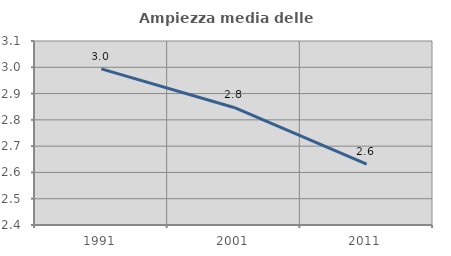
| Category | Ampiezza media delle famiglie |
|---|---|
| 1991.0 | 2.994 |
| 2001.0 | 2.847 |
| 2011.0 | 2.632 |